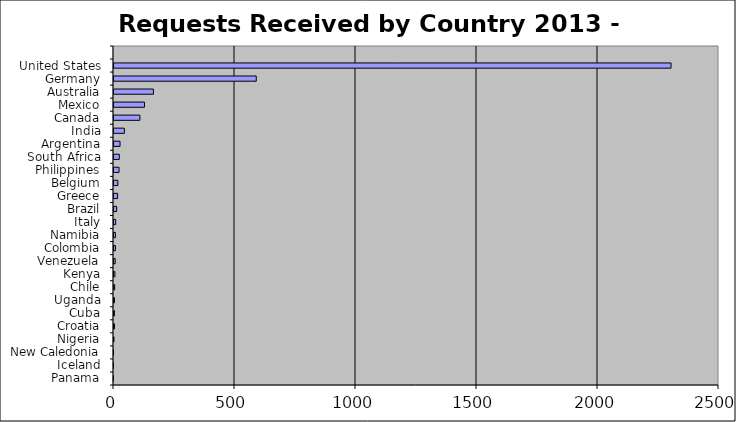
| Category | Series 0 | Series 1 |
|---|---|---|
| Panama | 1 | 0 |
| Iceland | 2 | 0.001 |
| New Caledonia | 2 | 0.001 |
| Nigeria | 4 | 0.001 |
| Croatia | 6 | 0.002 |
| Cuba | 6 | 0.002 |
| Uganda | 6 | 0.002 |
| Chile | 7 | 0.002 |
| Kenya | 8 | 0.002 |
| Venezuela | 9 | 0.003 |
| Colombia | 10 | 0.003 |
| Namibia | 10 | 0.003 |
| Italy | 11 | 0.003 |
| Brazil | 15 | 0.004 |
| Greece | 19 | 0.005 |
| Belgium | 20 | 0.006 |
| Philippines | 25 | 0.007 |
| South Africa | 26 | 0.007 |
| Argentina | 29 | 0.008 |
| India | 47 | 0.013 |
| Canada | 111 | 0.031 |
| Mexico | 130 | 0.036 |
| Australia | 167 | 0.047 |
| Germany | 592 | 0.166 |
| United States | 2306 | 0.645 |